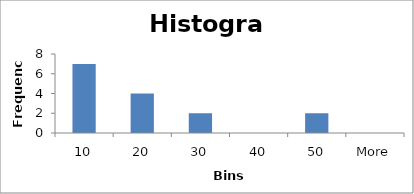
| Category | Frequency |
|---|---|
| 10 | 7 |
| 20 | 4 |
| 30 | 2 |
| 40 | 0 |
| 50 | 2 |
| More | 0 |